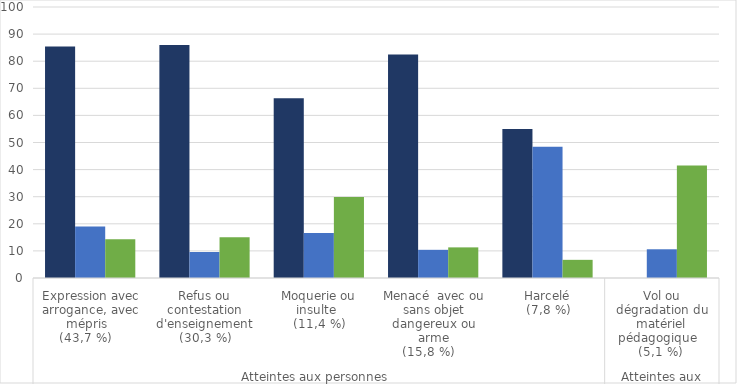
| Category | Parents d'élèves  | Collègues ou hiérarchie | Elèves ou groupe d'élèves |
|---|---|---|---|
| 0 | 85.4 | 19 | 14.3 |
| 1 | 86 | 9.6 | 15 |
| 2 | 66.3 | 16.6 | 29.9 |
| 3 | 82.5 | 10.4 | 11.3 |
| 4 | 55 | 48.4 | 6.7 |
| 5 | 0 | 10.6 | 41.5 |